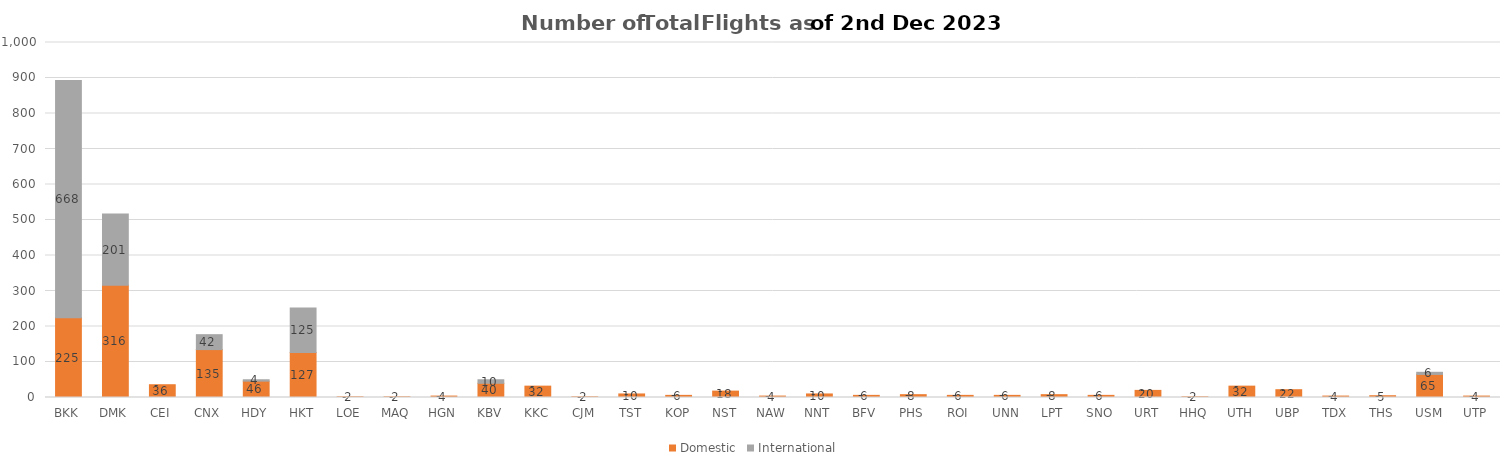
| Category | Domestic | International |
|---|---|---|
| BKK | 225 | 668 |
| DMK | 316 | 201 |
| CEI | 36 | 0 |
| CNX | 135 | 42 |
| HDY | 46 | 4 |
| HKT | 127 | 125 |
| LOE | 2 | 0 |
| MAQ | 2 | 0 |
| HGN | 4 | 0 |
| KBV | 40 | 10 |
| KKC | 32 | 0 |
| CJM | 2 | 0 |
| TST | 10 | 0 |
| KOP | 6 | 0 |
| NST | 18 | 0 |
| NAW | 4 | 0 |
| NNT | 10 | 0 |
| BFV | 6 | 0 |
| PHS | 8 | 0 |
| ROI | 6 | 0 |
| UNN | 6 | 0 |
| LPT | 8 | 0 |
| SNO | 6 | 0 |
| URT | 20 | 0 |
| HHQ | 2 | 0 |
| UTH | 32 | 0 |
| UBP | 22 | 0 |
| TDX | 4 | 0 |
| THS | 5 | 0 |
| USM | 65 | 6 |
| UTP | 4 | 0 |